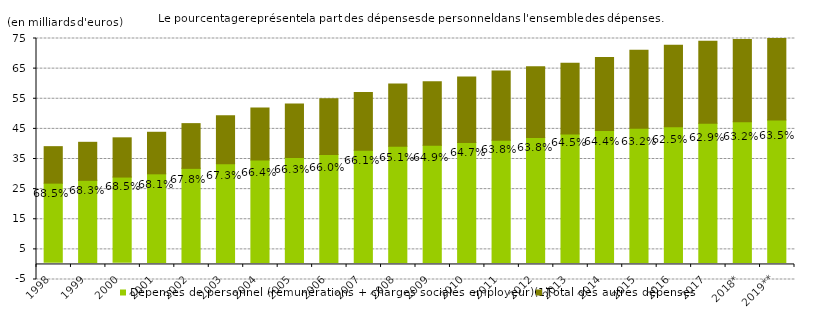
| Category | % | Dépenses de personnel (rémunérations + charges sociales employeur)(1) | Total des autres dépenses |
|---|---|---|---|
| 1998.0 | 0.685 | 26.3 | 12.113 |
| 1999.0 | 0.683 | 27.23 | 12.628 |
| 2000.0 | 0.685 | 28.318 | 13.027 |
| 2001.0 | 0.681 | 29.399 | 13.793 |
| 2002.0 | 0.678 | 31.211 | 14.855 |
| 2003.0 | 0.673 | 32.749 | 15.935 |
| 2004.0 | 0.664 | 34.005 | 17.227 |
| 2005.0 | 0.663 | 34.84 | 17.73 |
| 2006.0 | 0.66 | 35.851 | 18.457 |
| 2007.0 | 0.661 | 37.281 | 19.138 |
| 2008.0 | 0.651 | 38.546 | 20.669 |
| 2009.0 | 0.649 | 38.93 | 21.08 |
| 2010.0 | 0.647 | 39.831 | 21.704 |
| 2011.0 | 0.638 | 40.593 | 23.001 |
| 2012.0 | 0.638 | 41.459 | 23.528 |
| 2013.0 | 0.645 | 42.653 | 23.522 |
| 2014.0 | 0.644 | 43.799 | 24.239 |
| 2015.0 | 0.632 | 44.541 | 25.942 |
| 2016.0 | 0.625 | 45.117 | 27.02 |
| 2017.0 | 0.629 | 46.201 | 27.235 |
| 2018.0 | 0.632 | 46.75 | 27.277 |
| 2019.0 | 0.635 | 47.332 | 27.208 |